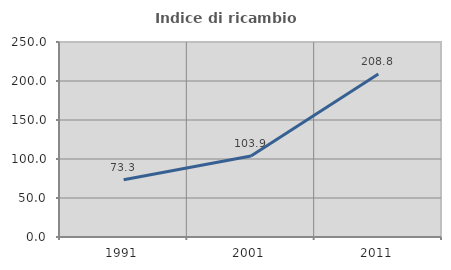
| Category | Indice di ricambio occupazionale  |
|---|---|
| 1991.0 | 73.315 |
| 2001.0 | 103.867 |
| 2011.0 | 208.848 |